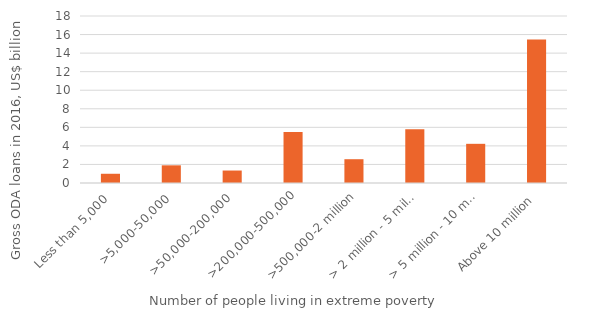
| Category | Series 0 |
|---|---|
| Less than 5,000 | 995.085 |
| >5,000-50,000 | 1904.749 |
| >50,000-200,000 | 1344.122 |
| >200,000-500,000 | 5506.533 |
| >500,000-2 million | 2564.133 |
| > 2 million - 5 million | 5803.504 |
| > 5 million - 10 million | 4223.167 |
| Above 10 million | 15466.392 |